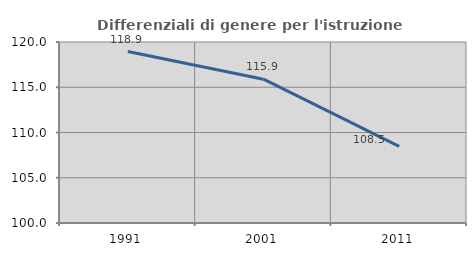
| Category | Differenziali di genere per l'istruzione superiore |
|---|---|
| 1991.0 | 118.949 |
| 2001.0 | 115.894 |
| 2011.0 | 108.471 |